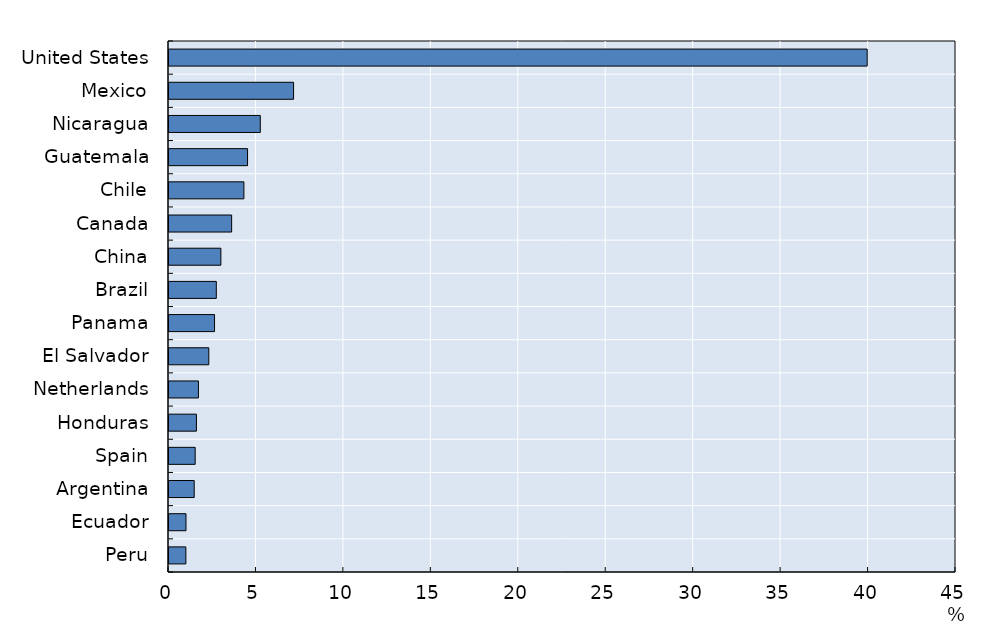
| Category | Series 0 |
|---|---|
| Peru | 0.965 |
| Ecuador | 0.971 |
| Argentina | 1.441 |
| Spain | 1.497 |
| Honduras | 1.569 |
| Netherlands | 1.683 |
| El Salvador | 2.276 |
| Panama | 2.604 |
| Brazil | 2.705 |
| China | 2.966 |
| Canada | 3.582 |
| Chile | 4.283 |
| Guatemala | 4.491 |
| Nicaragua | 5.221 |
| Mexico | 7.124 |
| United States | 39.922 |